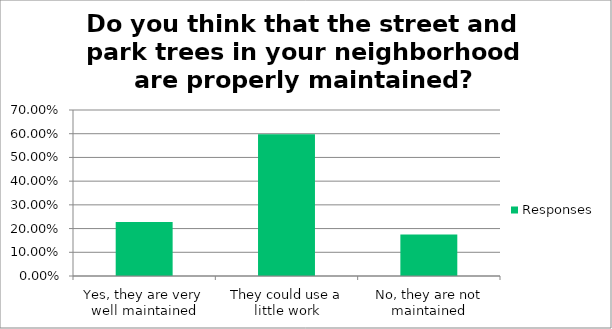
| Category | Responses |
|---|---|
| Yes, they are very well maintained | 0.227 |
| They could use a little work | 0.598 |
| No, they are not maintained | 0.175 |